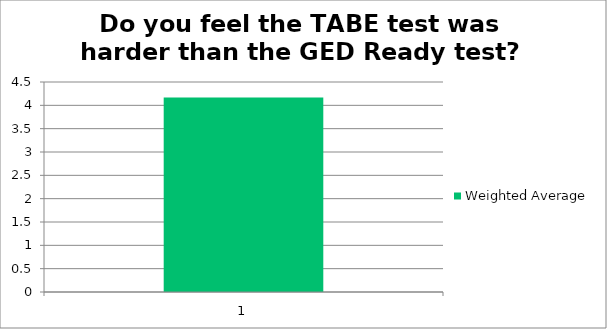
| Category | Weighted Average |
|---|---|
| 1.0 | 4.17 |